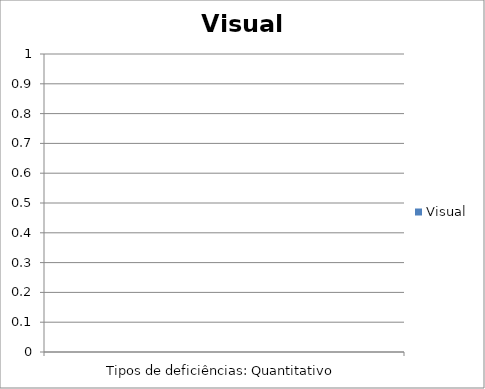
| Category | Visual |
|---|---|
| Tipos de deficiências: Quantitativo | 0 |